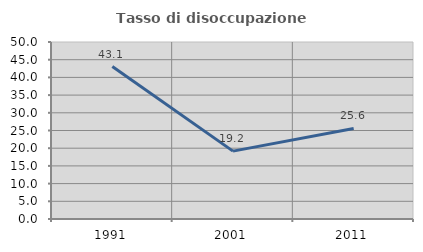
| Category | Tasso di disoccupazione giovanile  |
|---|---|
| 1991.0 | 43.077 |
| 2001.0 | 19.178 |
| 2011.0 | 25.581 |